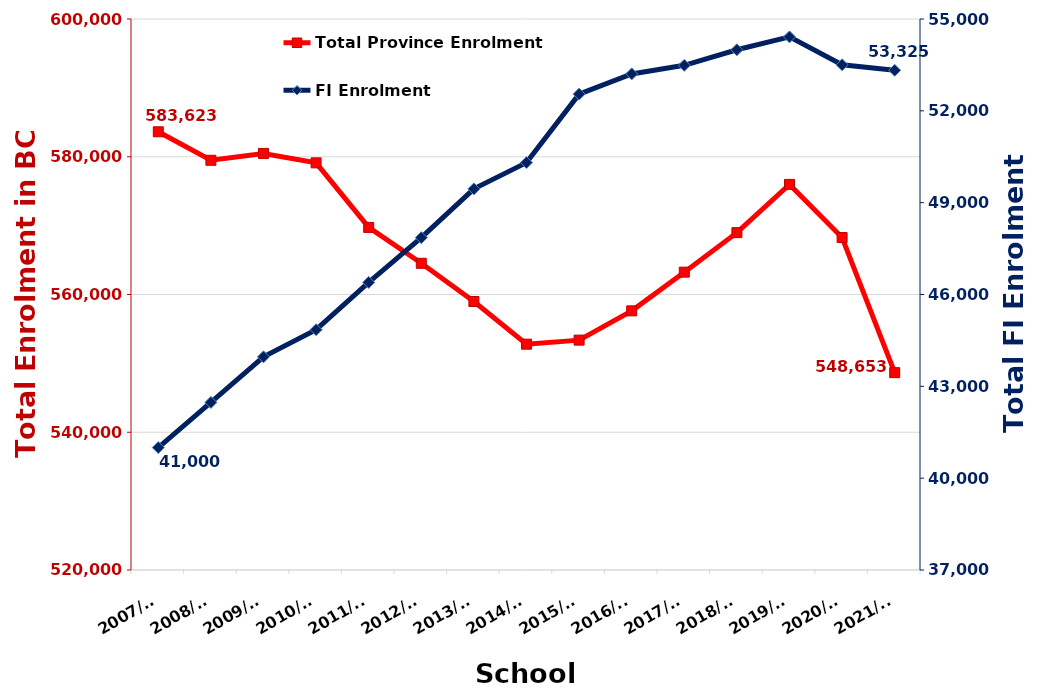
| Category | Total Province Enrolment |
|---|---|
| 2007/08 | 583623 |
| 2008/09 | 579486 |
| 2009/10 | 580483 |
| 2010/11 | 579112 |
| 2011/12 | 569740 |
| 2012/13 | 564532 |
| 2013/14 | 558985 |
| 2014/15 | 552788 |
| 2015/16 | 553375 |
| 2016/17 | 557625 |
| 2017/18 | 563244 |
| 2018/19 | 568983 |
| 2019/20 | 575986 |
| 2020/21 | 568271 |
| 2021/22 | 548653 |